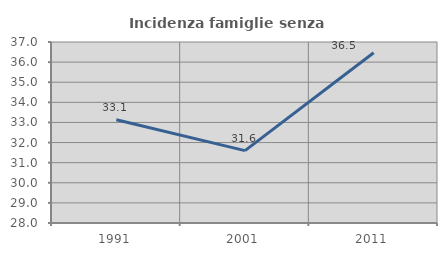
| Category | Incidenza famiglie senza nuclei |
|---|---|
| 1991.0 | 33.137 |
| 2001.0 | 31.599 |
| 2011.0 | 36.464 |